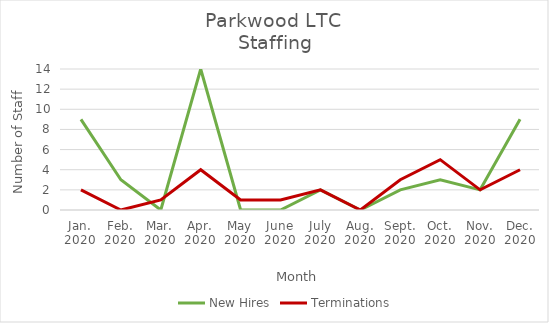
| Category | New Hires | Terminations |
|---|---|---|
| Jan.
2020 | 9 | 2 |
| Feb.
2020 | 3 | 0 |
| Mar.
2020 | 0 | 1 |
| Apr.
2020 | 14 | 4 |
| May
2020 | 0 | 1 |
| June
2020 | 0 | 1 |
| July
2020 | 2 | 2 |
| Aug.
2020 | 0 | 0 |
| Sept.
2020 | 2 | 3 |
| Oct.
2020 | 3 | 5 |
| Nov.
2020 | 2 | 2 |
| Dec.
2020 | 9 | 4 |